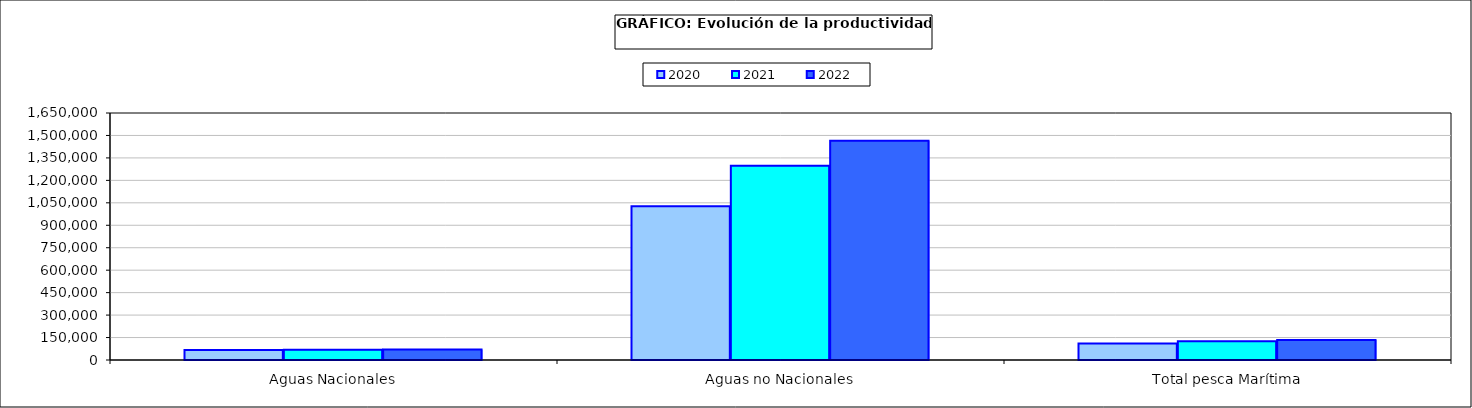
| Category | 2020 | 2021 | 2022 |
|---|---|---|---|
| 0 | 66113.082 | 68419.435 | 70969.148 |
| 1 | 1027429.335 | 1297634.486 | 1465224.233 |
| 2 | 109697.976 | 124497.351 | 133605.624 |